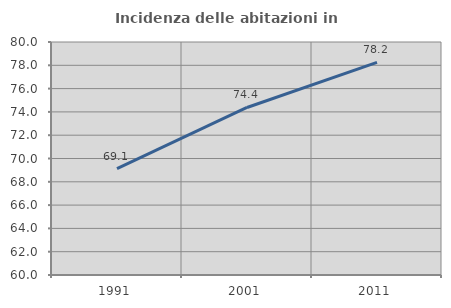
| Category | Incidenza delle abitazioni in proprietà  |
|---|---|
| 1991.0 | 69.13 |
| 2001.0 | 74.38 |
| 2011.0 | 78.244 |